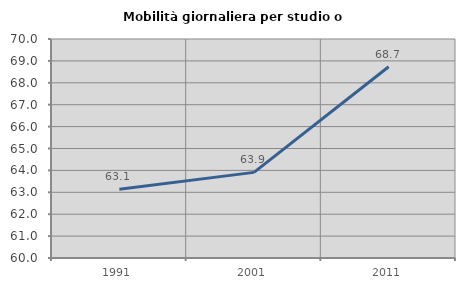
| Category | Mobilità giornaliera per studio o lavoro |
|---|---|
| 1991.0 | 63.144 |
| 2001.0 | 63.909 |
| 2011.0 | 68.735 |